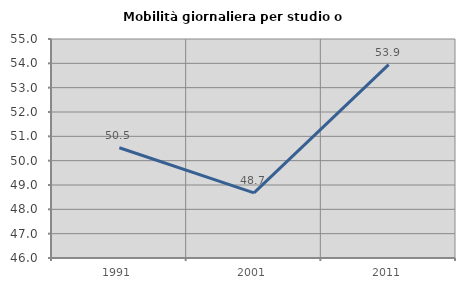
| Category | Mobilità giornaliera per studio o lavoro |
|---|---|
| 1991.0 | 50.53 |
| 2001.0 | 48.678 |
| 2011.0 | 53.946 |